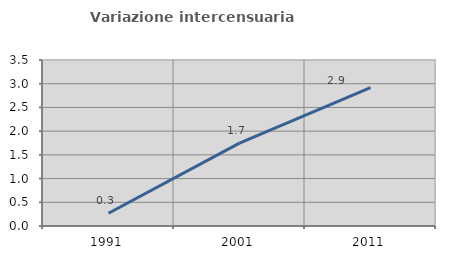
| Category | Variazione intercensuaria annua |
|---|---|
| 1991.0 | 0.27 |
| 2001.0 | 1.747 |
| 2011.0 | 2.915 |